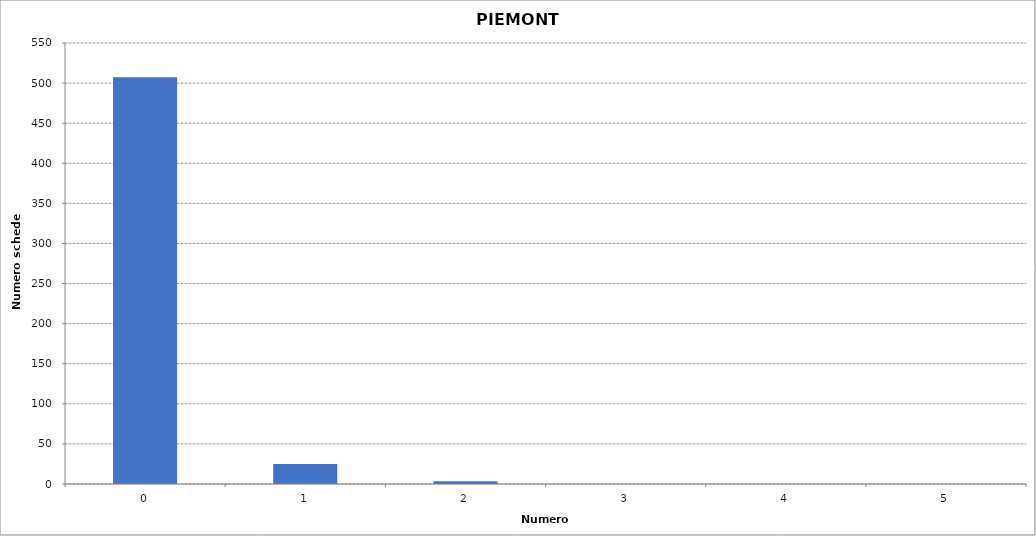
| Category | Series 0 |
|---|---|
| 0.0 | 507419 |
| 1.0 | 24927 |
| 2.0 | 3529 |
| 3.0 | 100 |
| 4.0 | 7 |
| 5.0 | 7 |